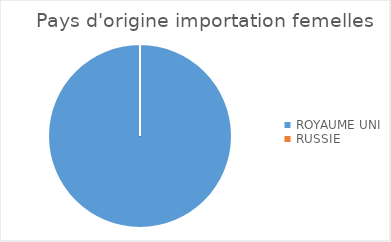
| Category | Series 0 |
|---|---|
| ROYAUME UNI | 1 |
| RUSSIE | 0 |